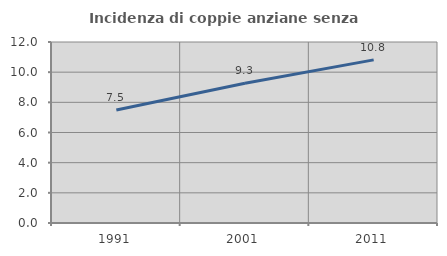
| Category | Incidenza di coppie anziane senza figli  |
|---|---|
| 1991.0 | 7.494 |
| 2001.0 | 9.265 |
| 2011.0 | 10.814 |